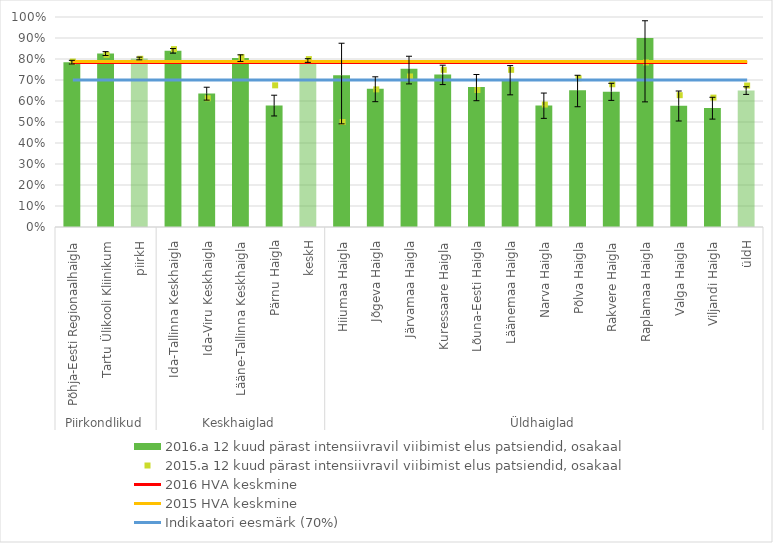
| Category | 2016.a 12 kuud pärast intensiivravil viibimist elus patsiendid, osakaal |
|---|---|
| 0 | 0.785 |
| 1 | 0.826 |
| 2 | 0.803 |
| 3 | 0.839 |
| 4 | 0.635 |
| 5 | 0.805 |
| 6 | 0.579 |
| 7 | 0.793 |
| 8 | 0.722 |
| 9 | 0.658 |
| 10 | 0.753 |
| 11 | 0.727 |
| 12 | 0.667 |
| 13 | 0.704 |
| 14 | 0.579 |
| 15 | 0.651 |
| 16 | 0.645 |
| 17 | 0.9 |
| 18 | 0.578 |
| 19 | 0.566 |
| 20 | 0.65 |